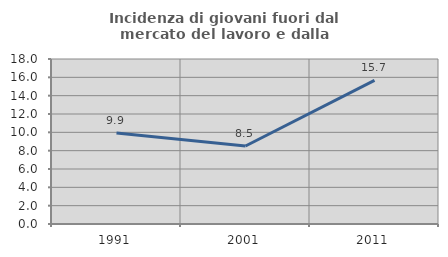
| Category | Incidenza di giovani fuori dal mercato del lavoro e dalla formazione  |
|---|---|
| 1991.0 | 9.929 |
| 2001.0 | 8.511 |
| 2011.0 | 15.663 |